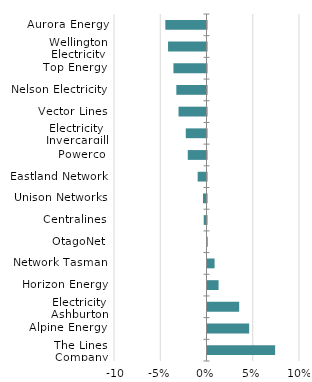
| Category | Series 0 |
|---|---|
| Aurora Energy | -0.045 |
| Wellington Electricity | -0.042 |
| Top Energy | -0.036 |
| Nelson Electricity | -0.033 |
| Vector Lines | -0.03 |
| Electricity Invercargill | -0.022 |
| Powerco | -0.02 |
| Eastland Network | -0.01 |
| Unison Networks | -0.004 |
| Centralines | -0.003 |
| OtagoNet | 0 |
| Network Tasman | 0.008 |
| Horizon Energy | 0.012 |
| Electricity Ashburton | 0.034 |
| Alpine Energy | 0.045 |
| The Lines Company | 0.073 |